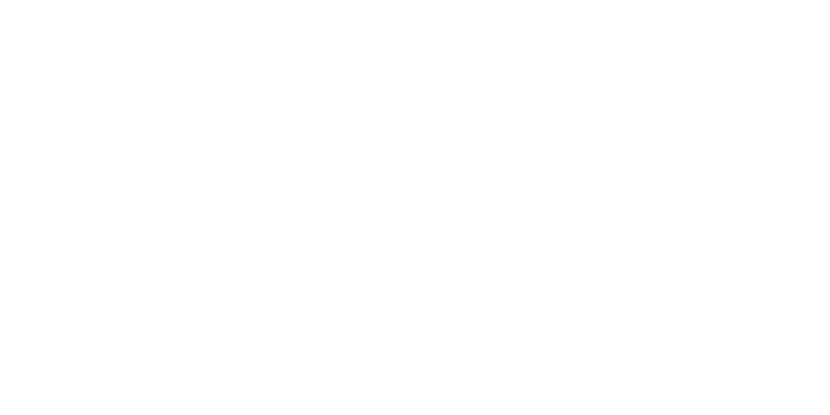
| Category | Total |
|---|---|
| Al Hodeidah | 76435 |
| Hajjah | 72348 |
| Marib | 46448 |
| Al Jawf | 14118 |
| Taiz | 13486 |
| Hadramawt | 8309 |
| Abyan | 5345 |
| Sadah | 5304 |
| Lahj | 4927 |
| Amran | 4119 |
| Sanaa | 3887 |
| Ad Dali | 3816 |
| Aden | 3431 |
| Ibb | 2830 |
| Al Bayda | 1615 |
| Dhamar | 1295 |
| Al Mahwit | 1208 |
| Shabwah | 1015 |
| Al Maharah | 457 |
| Raymah | 451 |
| Sanaa City | 167 |
| Socotra | 15 |